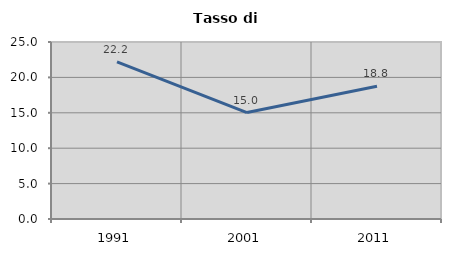
| Category | Tasso di disoccupazione   |
|---|---|
| 1991.0 | 22.2 |
| 2001.0 | 15.036 |
| 2011.0 | 18.75 |